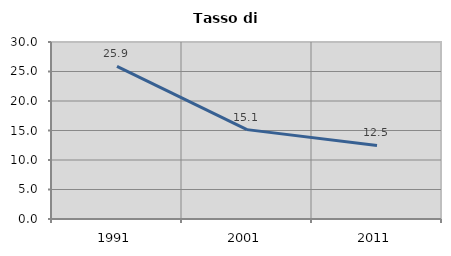
| Category | Tasso di disoccupazione   |
|---|---|
| 1991.0 | 25.876 |
| 2001.0 | 15.149 |
| 2011.0 | 12.465 |